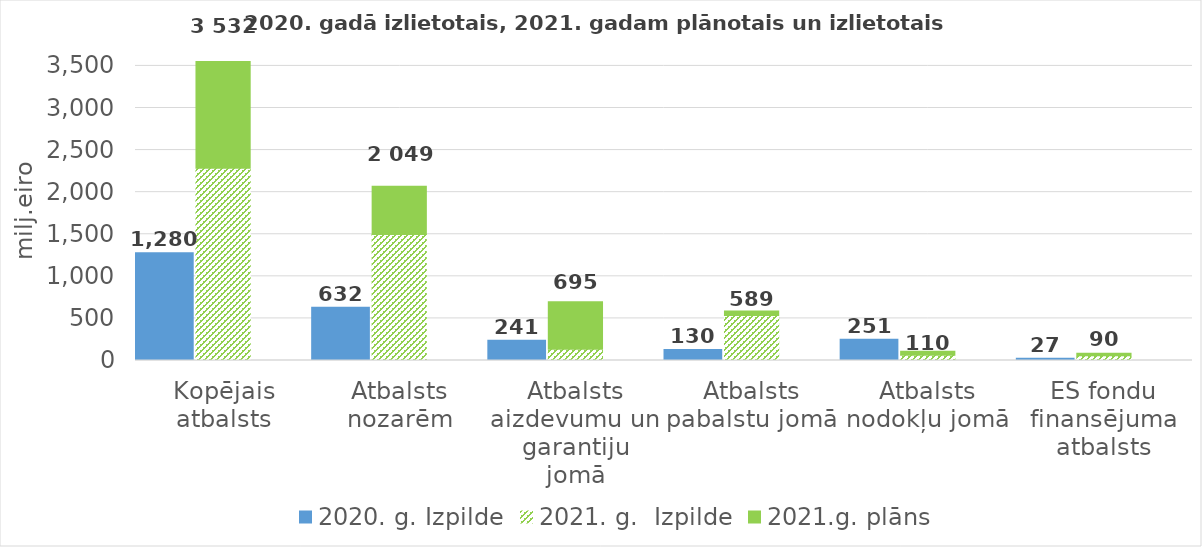
| Category | 2020. g. Izpilde |
|---|---|
| 0 |  |
| 1 |  |
| 2 |  |
| 3 |  |
| 4 |  |
| 5 |  |